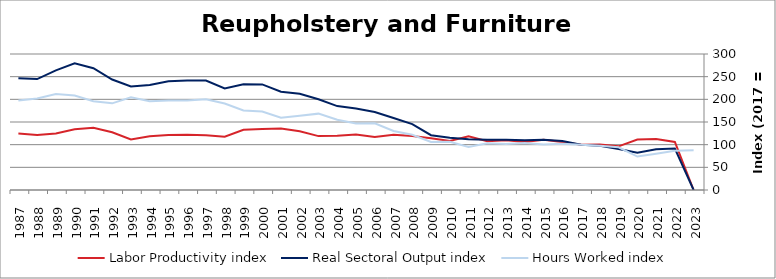
| Category | Labor Productivity index | Real Sectoral Output index | Hours Worked index |
|---|---|---|---|
| 2023.0 | 0 | 0 | 87.899 |
| 2022.0 | 105.913 | 91.572 | 86.46 |
| 2021.0 | 112.331 | 89.873 | 80.007 |
| 2020.0 | 111.401 | 82.146 | 73.739 |
| 2019.0 | 96.323 | 90.635 | 94.095 |
| 2018.0 | 100.226 | 97.681 | 97.46 |
| 2017.0 | 100 | 100 | 100 |
| 2016.0 | 105.791 | 107.997 | 102.086 |
| 2015.0 | 110.852 | 110.997 | 100.131 |
| 2014.0 | 105.837 | 110.008 | 103.94 |
| 2013.0 | 109.586 | 111.092 | 101.375 |
| 2012.0 | 107.734 | 111.076 | 103.103 |
| 2011.0 | 118.382 | 112.117 | 94.708 |
| 2010.0 | 108.248 | 115.054 | 106.287 |
| 2009.0 | 114.021 | 120.895 | 106.029 |
| 2008.0 | 119.343 | 145.462 | 121.886 |
| 2007.0 | 121.912 | 158.843 | 130.293 |
| 2006.0 | 116.986 | 172.218 | 147.213 |
| 2005.0 | 122.455 | 179.895 | 146.907 |
| 2004.0 | 119.461 | 185.136 | 154.976 |
| 2003.0 | 118.881 | 200.249 | 168.445 |
| 2002.0 | 129.525 | 212.182 | 163.815 |
| 2001.0 | 135.906 | 216.865 | 159.57 |
| 2000.0 | 134.401 | 232.884 | 173.276 |
| 1999.0 | 132.877 | 233.213 | 175.511 |
| 1998.0 | 117.49 | 223.978 | 190.636 |
| 1997.0 | 120.545 | 241.269 | 200.148 |
| 1996.0 | 122.091 | 241.31 | 197.648 |
| 1995.0 | 121.35 | 239.84 | 197.644 |
| 1994.0 | 118.343 | 231.641 | 195.737 |
| 1993.0 | 111.493 | 228.282 | 204.751 |
| 1992.0 | 127.477 | 243.641 | 191.126 |
| 1991.0 | 137.167 | 268.59 | 195.813 |
| 1990.0 | 134.134 | 279.414 | 208.31 |
| 1989.0 | 124.773 | 263.964 | 211.555 |
| 1988.0 | 121.307 | 244.705 | 201.723 |
| 1987.0 | 124.832 | 246.525 | 197.486 |